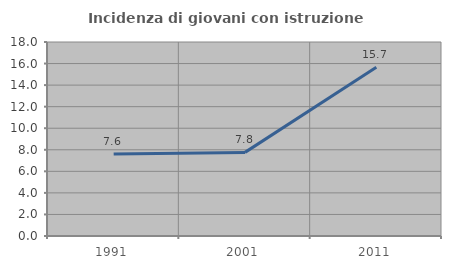
| Category | Incidenza di giovani con istruzione universitaria |
|---|---|
| 1991.0 | 7.6 |
| 2001.0 | 7.759 |
| 2011.0 | 15.667 |